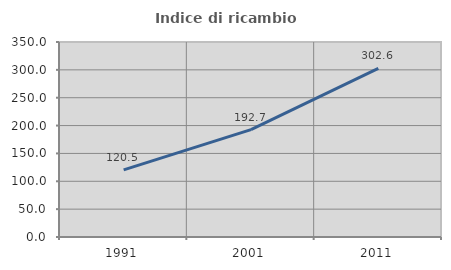
| Category | Indice di ricambio occupazionale  |
|---|---|
| 1991.0 | 120.455 |
| 2001.0 | 192.661 |
| 2011.0 | 302.632 |